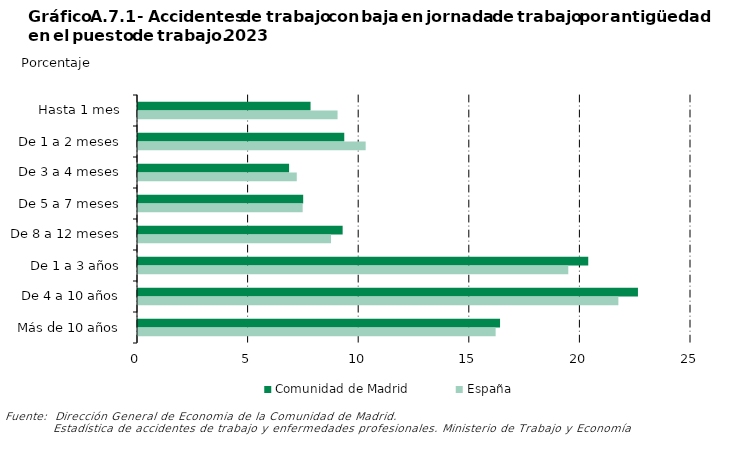
| Category | Comunidad de Madrid | España |
|---|---|---|
| 0 | 7.801 | 9.022 |
| 1 | 9.325 | 10.293 |
| 2 | 6.83 | 7.178 |
| 3 | 7.468 | 7.445 |
| 4 | 9.252 | 8.725 |
| 5 | 20.355 | 19.452 |
| 6 | 22.602 | 21.717 |
| 7 | 16.368 | 16.168 |